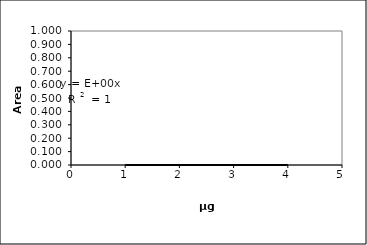
| Category | Series 0 |
|---|---|
| 0.0 | 0 |
| 0.0 | 0 |
| 0.0 | 0 |
| 0.0 | 0 |